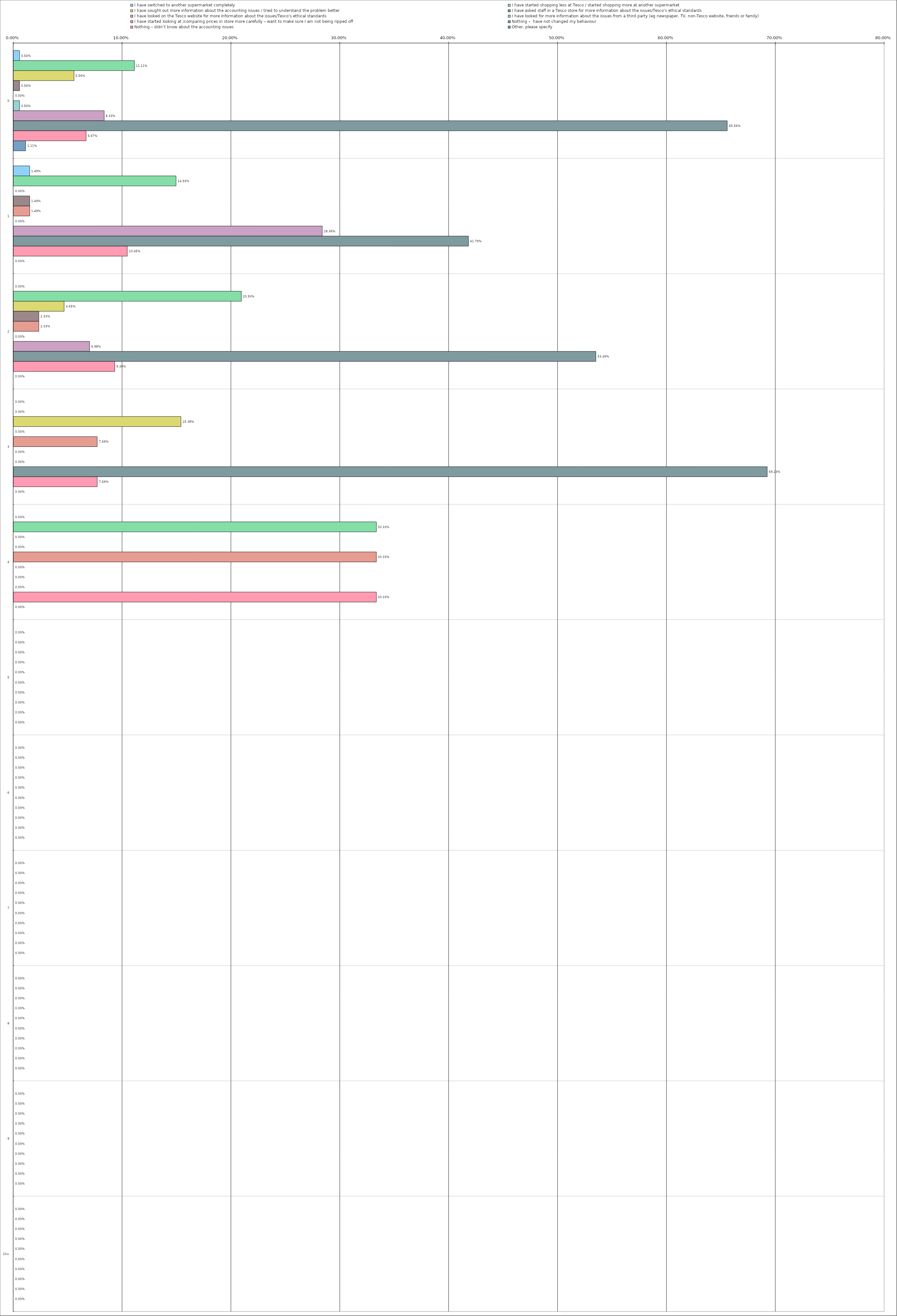
| Category | I have switched to another supermarket completely | I have started shopping less at Tesco / started shopping more at another supermarket | I have sought out more information about the accounting issues / tried to understand the problem better | I have asked staff in a Tesco store for more information about the issues/Tesco’s ethical standards | I have looked on the Tesco website for more information about the issues/Tesco’s ethical standards | I have looked for more information about the issues from a third party (eg newspaper, TV, non-Tesco website, friends or family) | I have started looking at /comparing prices in store more carefully – want to make sure I am not being ripped off | Nothing –  have not changed my behaviour | Nothing – didn’t know about the accounting issues | Other, please specify |
|---|---|---|---|---|---|---|---|---|---|---|
| 0 | 0.006 | 0.111 | 0.056 | 0.006 | 0 | 0.006 | 0.083 | 0.656 | 0.067 | 0.011 |
| 1 | 0.015 | 0.149 | 0 | 0.015 | 0.015 | 0 | 0.284 | 0.418 | 0.104 | 0 |
| 2 | 0 | 0.209 | 0.046 | 0.023 | 0.023 | 0 | 0.07 | 0.535 | 0.093 | 0 |
| 3 | 0 | 0 | 0.154 | 0 | 0.077 | 0 | 0 | 0.692 | 0.077 | 0 |
| 4 | 0 | 0.333 | 0 | 0 | 0.333 | 0 | 0 | 0 | 0.333 | 0 |
| 5 | 0 | 0 | 0 | 0 | 0 | 0 | 0 | 0 | 0 | 0 |
| 6 | 0 | 0 | 0 | 0 | 0 | 0 | 0 | 0 | 0 | 0 |
| 7 | 0 | 0 | 0 | 0 | 0 | 0 | 0 | 0 | 0 | 0 |
| 8 | 0 | 0 | 0 | 0 | 0 | 0 | 0 | 0 | 0 | 0 |
| 9 | 0 | 0 | 0 | 0 | 0 | 0 | 0 | 0 | 0 | 0 |
| 10 | 0 | 0 | 0 | 0 | 0 | 0 | 0 | 0 | 0 | 0 |